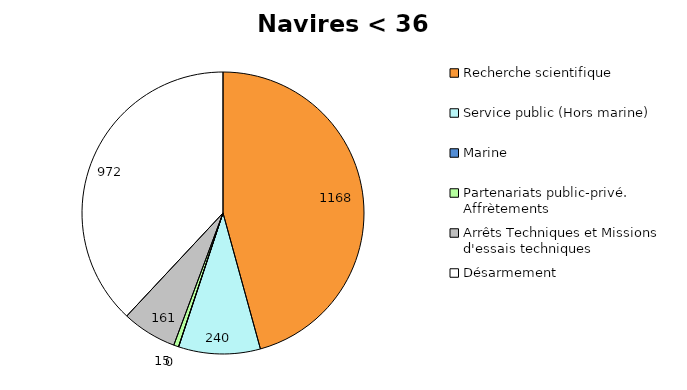
| Category | 0  |
|---|---|
| Recherche scientifique | 1168.219 |
| Service public (Hors marine) | 239.573 |
| Marine | 0 |
| Partenariats public-privé. Affrètements | 14.655 |
| Arrêts Techniques et Missions d'essais techniques | 160.553 |
| Désarmement | 972 |